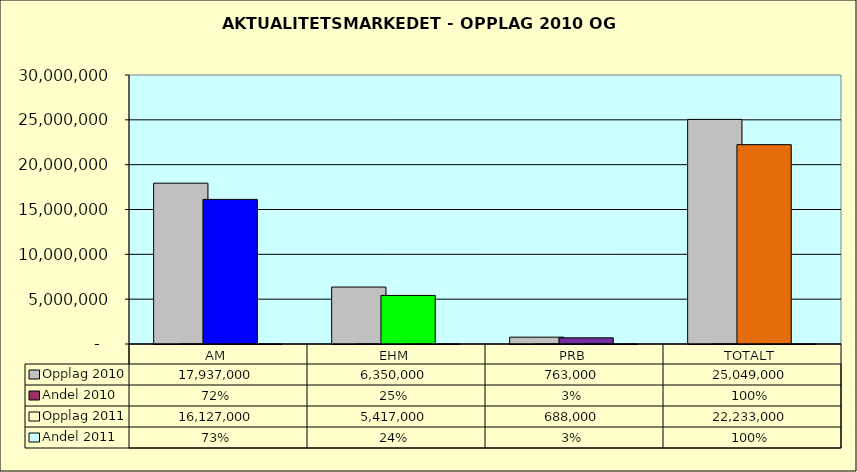
| Category | Opplag 2010 | Andel 2010 | Opplag 2011 | Andel 2011 |
|---|---|---|---|---|
| AM | 17937000 | 0.716 | 16127000 | 0.725 |
| EHM | 6350000 | 0.254 | 5417000 | 0.244 |
| PRB | 763000 | 0.03 | 688000 | 0.031 |
| TOTALT | 25049000 | 1 | 22233000 | 1 |